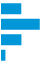
| Category | Series 0 |
|---|---|
| 0 | 0.241 |
| 1 | 0.472 |
| 2 | 0.243 |
| 3 | 0.043 |